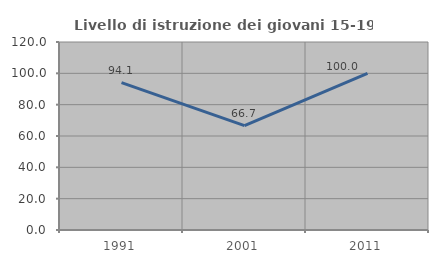
| Category | Livello di istruzione dei giovani 15-19 anni |
|---|---|
| 1991.0 | 94.118 |
| 2001.0 | 66.667 |
| 2011.0 | 100 |